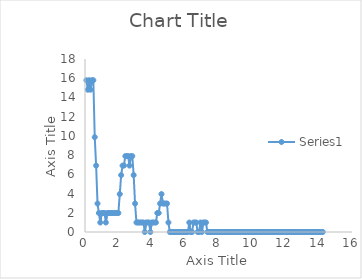
| Category | Series 0 |
|---|---|
| 0.08333333333333333 | 15.79 |
| 0.16666666666666666 | 14.803 |
| 0.25 | 15.79 |
| 0.3333333333333333 | 14.803 |
| 0.4166666666666667 | 15.79 |
| 0.5 | 15.79 |
| 0.5833333333333334 | 9.868 |
| 0.6666666666666666 | 6.908 |
| 0.75 | 2.961 |
| 0.8333333333333334 | 1.974 |
| 0.9166666666666666 | 0.987 |
| 1.0 | 1.974 |
| 1.0833333333333333 | 1.974 |
| 1.1666666666666667 | 1.974 |
| 1.25 | 0.987 |
| 1.3333333333333333 | 1.974 |
| 1.4166666666666667 | 1.974 |
| 1.5 | 1.974 |
| 1.5833333333333333 | 1.974 |
| 1.6666666666666667 | 1.974 |
| 1.75 | 1.974 |
| 1.8333333333333333 | 1.974 |
| 1.9166666666666667 | 1.974 |
| 2.0 | 1.974 |
| 2.0833333333333335 | 3.947 |
| 2.1666666666666665 | 5.921 |
| 2.25 | 6.908 |
| 2.3333333333333335 | 6.908 |
| 2.4166666666666665 | 7.895 |
| 2.5 | 7.895 |
| 2.5833333333333335 | 7.895 |
| 2.6666666666666665 | 6.908 |
| 2.75 | 7.895 |
| 2.8333333333333335 | 7.895 |
| 2.9166666666666665 | 5.921 |
| 3.0 | 2.961 |
| 3.0833333333333335 | 0.987 |
| 3.1666666666666665 | 0.987 |
| 3.25 | 0.987 |
| 3.3333333333333335 | 0.987 |
| 3.4166666666666665 | 0.987 |
| 3.5 | 0.987 |
| 3.5833333333333335 | 0 |
| 3.6666666666666665 | 0.987 |
| 3.75 | 0.987 |
| 3.8333333333333335 | 0.987 |
| 3.9166666666666665 | 0 |
| 4.0 | 0.987 |
| 4.083333333333333 | 0.987 |
| 4.166666666666667 | 0.987 |
| 4.25 | 0.987 |
| 4.333333333333333 | 1.974 |
| 4.416666666666667 | 1.974 |
| 4.5 | 2.961 |
| 4.583333333333333 | 3.947 |
| 4.666666666666667 | 2.961 |
| 4.75 | 2.961 |
| 4.833333333333333 | 2.961 |
| 4.916666666666667 | 2.961 |
| 5.0 | 0.987 |
| 5.083333333333333 | 0 |
| 5.166666666666667 | 0 |
| 5.25 | 0 |
| 5.333333333333333 | 0 |
| 5.416666666666667 | 0 |
| 5.5 | 0 |
| 5.583333333333333 | 0 |
| 5.666666666666667 | 0 |
| 5.75 | 0 |
| 5.833333333333333 | 0 |
| 5.916666666666667 | 0 |
| 6.0 | 0 |
| 6.083333333333333 | 0 |
| 6.166666666666667 | 0 |
| 6.25 | 0.987 |
| 6.333333333333333 | 0 |
| 6.416666666666667 | 0 |
| 6.5 | 0.987 |
| 6.583333333333333 | 0.987 |
| 6.666666666666667 | 0.987 |
| 6.75 | 0 |
| 6.833333333333333 | 0 |
| 6.916666666666667 | 0.987 |
| 7.0 | 0 |
| 7.083333333333333 | 0.987 |
| 7.166666666666667 | 0.987 |
| 7.25 | 0.987 |
| 7.333333333333333 | 0 |
| 7.416666666666667 | 0 |
| 7.5 | 0 |
| 7.583333333333333 | 0 |
| 7.666666666666667 | 0 |
| 7.75 | 0 |
| 7.833333333333333 | 0 |
| 7.916666666666667 | 0 |
| 8.0 | 0 |
| 8.083333333333334 | 0 |
| 8.166666666666666 | 0 |
| 8.25 | 0 |
| 8.333333333333334 | 0 |
| 8.416666666666666 | 0 |
| 8.5 | 0 |
| 8.583333333333334 | 0 |
| 8.666666666666666 | 0 |
| 8.75 | 0 |
| 8.833333333333334 | 0 |
| 8.916666666666666 | 0 |
| 9.0 | 0 |
| 9.083333333333334 | 0 |
| 9.166666666666666 | 0 |
| 9.25 | 0 |
| 9.333333333333334 | 0 |
| 9.416666666666666 | 0 |
| 9.5 | 0 |
| 9.583333333333334 | 0 |
| 9.666666666666666 | 0 |
| 9.75 | 0 |
| 9.833333333333334 | 0 |
| 9.916666666666666 | 0 |
| 10.0 | 0 |
| 10.083333333333334 | 0 |
| 10.166666666666666 | 0 |
| 10.25 | 0 |
| 10.333333333333334 | 0 |
| 10.416666666666666 | 0 |
| 10.5 | 0 |
| 10.583333333333334 | 0 |
| 10.666666666666666 | 0 |
| 10.75 | 0 |
| 10.833333333333334 | 0 |
| 10.916666666666666 | 0 |
| 11.0 | 0 |
| 11.083333333333334 | 0 |
| 11.166666666666666 | 0 |
| 11.25 | 0 |
| 11.333333333333334 | 0 |
| 11.416666666666666 | 0 |
| 11.5 | 0 |
| 11.583333333333334 | 0 |
| 11.666666666666666 | 0 |
| 11.75 | 0 |
| 11.833333333333334 | 0 |
| 11.916666666666666 | 0 |
| 12.0 | 0 |
| 12.083333333333334 | 0 |
| 12.166666666666666 | 0 |
| 12.25 | 0 |
| 12.333333333333334 | 0 |
| 12.416666666666666 | 0 |
| 12.5 | 0 |
| 12.583333333333334 | 0 |
| 12.666666666666666 | 0 |
| 12.75 | 0 |
| 12.833333333333334 | 0 |
| 12.916666666666666 | 0 |
| 13.0 | 0 |
| 13.083333333333334 | 0 |
| 13.166666666666666 | 0 |
| 13.25 | 0 |
| 13.333333333333334 | 0 |
| 13.416666666666666 | 0 |
| 13.5 | 0 |
| 13.583333333333334 | 0 |
| 13.666666666666666 | 0 |
| 13.75 | 0 |
| 13.833333333333334 | 0 |
| 13.916666666666666 | 0 |
| 14.0 | 0 |
| 14.083333333333334 | 0 |
| 14.166666666666666 | 0 |
| 14.25 | 0 |